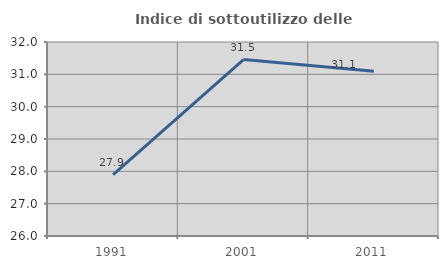
| Category | Indice di sottoutilizzo delle abitazioni  |
|---|---|
| 1991.0 | 27.899 |
| 2001.0 | 31.455 |
| 2011.0 | 31.098 |